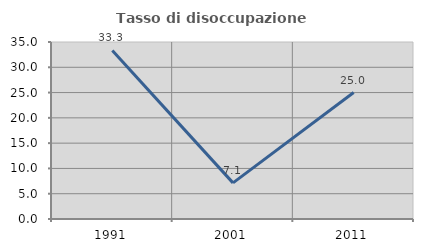
| Category | Tasso di disoccupazione giovanile  |
|---|---|
| 1991.0 | 33.333 |
| 2001.0 | 7.143 |
| 2011.0 | 25 |